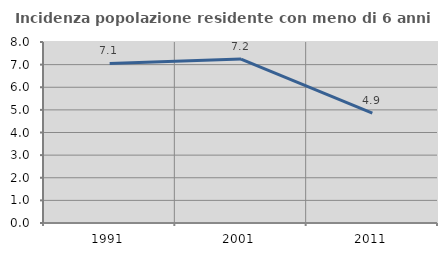
| Category | Incidenza popolazione residente con meno di 6 anni |
|---|---|
| 1991.0 | 7.051 |
| 2001.0 | 7.247 |
| 2011.0 | 4.854 |